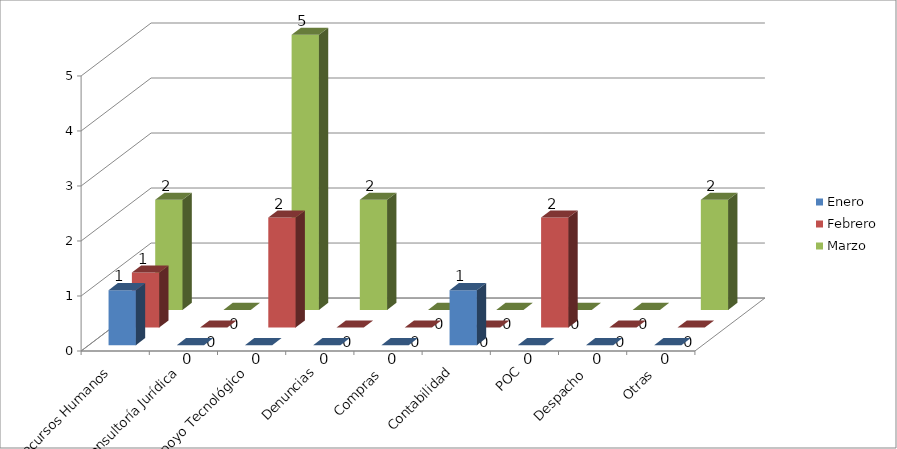
| Category | Enero | Febrero | Marzo |
|---|---|---|---|
| Recursos Humanos | 1 | 1 | 2 |
| Consultoría Jurídica | 0 | 0 | 0 |
| Apoyo Tecnológico | 0 | 2 | 5 |
| Denuncias | 0 | 0 | 2 |
| Compras  | 0 | 0 | 0 |
| Contabilidad | 1 | 0 | 0 |
| POC | 0 | 2 | 0 |
| Despacho  | 0 | 0 | 0 |
| Otras  | 0 | 0 | 2 |